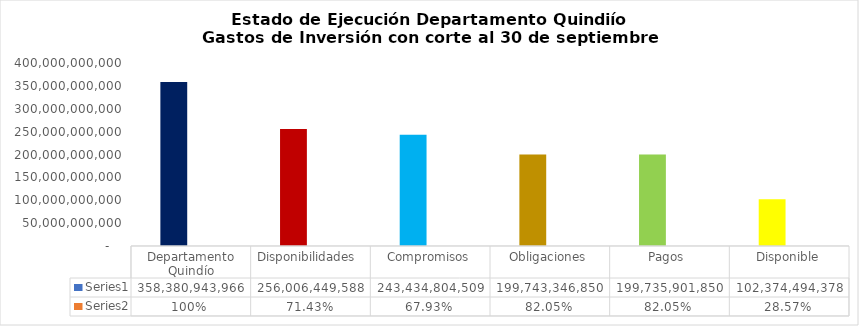
| Category | Series 0 | Series 1 |
|---|---|---|
| Departamento Quindío | 358380943965.87 | 1 |
| Disponibilidades  | 256006449587.87 | 0.714 |
| Compromisos | 243434804509.23 | 0.679 |
| Obligaciones | 199743346849.69 | 0.821 |
| Pagos  | 199735901849.69 | 0.82 |
| Disponible | 102374494378 | 0.286 |